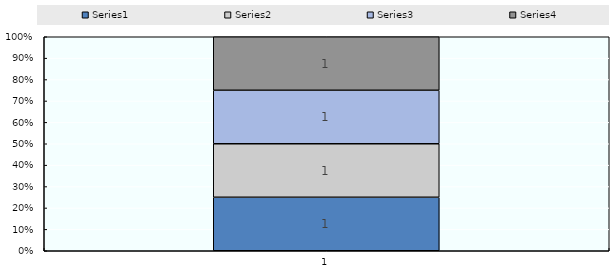
| Category | Series 0 | Series 1 | Series 2 | Series 3 |
|---|---|---|---|---|
| 0 | 1 | 1 | 1 | 1 |